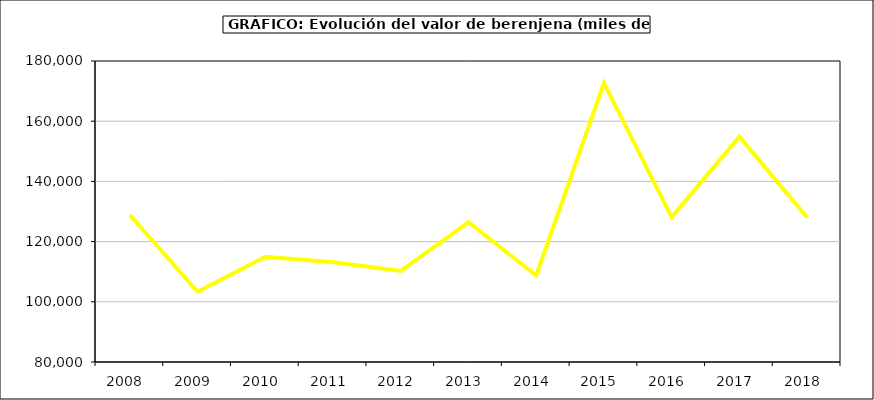
| Category | Valor |
|---|---|
| 2008.0 | 128841.418 |
| 2009.0 | 103302.87 |
| 2010.0 | 114934.838 |
| 2011.0 | 113149.264 |
| 2012.0 | 110271.616 |
| 2013.0 | 126461.496 |
| 2014.0 | 108753.977 |
| 2015.0 | 172694 |
| 2016.0 | 128140 |
| 2017.0 | 154840.085 |
| 2018.0 | 127980.525 |